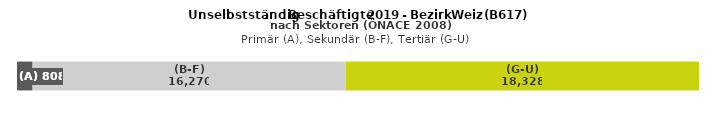
| Category | (A) | (B-F) | (G-U) |
|---|---|---|---|
| 0 | 808 | 16270 | 18328 |